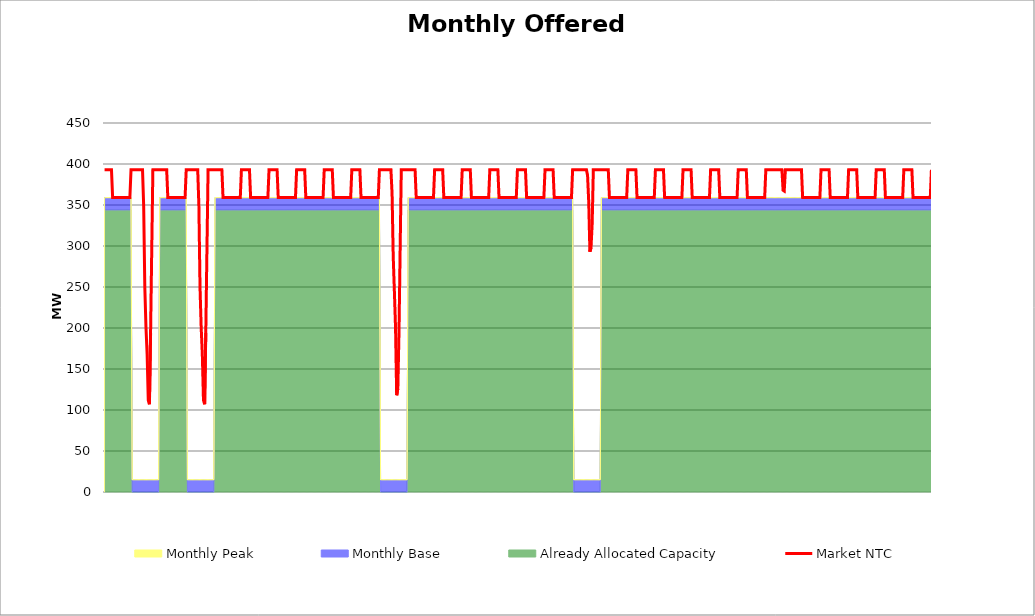
| Category | Market NTC |
|---|---|
| 0 | 393 |
| 1 | 393 |
| 2 | 393 |
| 3 | 393 |
| 4 | 393 |
| 5 | 393 |
| 6 | 393 |
| 7 | 359 |
| 8 | 359 |
| 9 | 359 |
| 10 | 359 |
| 11 | 359 |
| 12 | 359 |
| 13 | 359 |
| 14 | 359 |
| 15 | 359 |
| 16 | 359 |
| 17 | 359 |
| 18 | 359 |
| 19 | 359 |
| 20 | 359 |
| 21 | 359 |
| 22 | 359 |
| 23 | 393 |
| 24 | 393 |
| 25 | 393 |
| 26 | 393 |
| 27 | 393 |
| 28 | 393 |
| 29 | 393 |
| 30 | 393 |
| 31 | 393 |
| 32 | 393 |
| 33 | 393 |
| 34 | 349 |
| 35 | 249 |
| 36 | 201 |
| 37 | 168 |
| 38 | 112 |
| 39 | 107 |
| 40 | 194 |
| 41 | 294 |
| 42 | 393 |
| 43 | 393 |
| 44 | 393 |
| 45 | 393 |
| 46 | 393 |
| 47 | 393 |
| 48 | 393 |
| 49 | 393 |
| 50 | 393 |
| 51 | 393 |
| 52 | 393 |
| 53 | 393 |
| 54 | 393 |
| 55 | 359 |
| 56 | 359 |
| 57 | 359 |
| 58 | 359 |
| 59 | 359 |
| 60 | 359 |
| 61 | 359 |
| 62 | 359 |
| 63 | 359 |
| 64 | 359 |
| 65 | 359 |
| 66 | 359 |
| 67 | 359 |
| 68 | 359 |
| 69 | 359 |
| 70 | 359 |
| 71 | 393 |
| 72 | 393 |
| 73 | 393 |
| 74 | 393 |
| 75 | 393 |
| 76 | 393 |
| 77 | 393 |
| 78 | 393 |
| 79 | 393 |
| 80 | 393 |
| 81 | 393 |
| 82 | 349 |
| 83 | 249 |
| 84 | 201 |
| 85 | 168 |
| 86 | 112 |
| 87 | 107 |
| 88 | 194 |
| 89 | 294 |
| 90 | 393 |
| 91 | 393 |
| 92 | 393 |
| 93 | 393 |
| 94 | 393 |
| 95 | 393 |
| 96 | 393 |
| 97 | 393 |
| 98 | 393 |
| 99 | 393 |
| 100 | 393 |
| 101 | 393 |
| 102 | 393 |
| 103 | 359 |
| 104 | 359 |
| 105 | 359 |
| 106 | 359 |
| 107 | 359 |
| 108 | 359 |
| 109 | 359 |
| 110 | 359 |
| 111 | 359 |
| 112 | 359 |
| 113 | 359 |
| 114 | 359 |
| 115 | 359 |
| 116 | 359 |
| 117 | 359 |
| 118 | 359 |
| 119 | 393 |
| 120 | 393 |
| 121 | 393 |
| 122 | 393 |
| 123 | 393 |
| 124 | 393 |
| 125 | 393 |
| 126 | 393 |
| 127 | 359 |
| 128 | 359 |
| 129 | 359 |
| 130 | 359 |
| 131 | 359 |
| 132 | 359 |
| 133 | 359 |
| 134 | 359 |
| 135 | 359 |
| 136 | 359 |
| 137 | 359 |
| 138 | 359 |
| 139 | 359 |
| 140 | 359 |
| 141 | 359 |
| 142 | 359 |
| 143 | 393 |
| 144 | 393 |
| 145 | 393 |
| 146 | 393 |
| 147 | 393 |
| 148 | 393 |
| 149 | 393 |
| 150 | 393 |
| 151 | 359 |
| 152 | 359 |
| 153 | 359 |
| 154 | 359 |
| 155 | 359 |
| 156 | 359 |
| 157 | 359 |
| 158 | 359 |
| 159 | 359 |
| 160 | 359 |
| 161 | 359 |
| 162 | 359 |
| 163 | 359 |
| 164 | 359 |
| 165 | 359 |
| 166 | 359 |
| 167 | 393 |
| 168 | 393 |
| 169 | 393 |
| 170 | 393 |
| 171 | 393 |
| 172 | 393 |
| 173 | 393 |
| 174 | 393 |
| 175 | 359 |
| 176 | 359 |
| 177 | 359 |
| 178 | 359 |
| 179 | 359 |
| 180 | 359 |
| 181 | 359 |
| 182 | 359 |
| 183 | 359 |
| 184 | 359 |
| 185 | 359 |
| 186 | 359 |
| 187 | 359 |
| 188 | 359 |
| 189 | 359 |
| 190 | 359 |
| 191 | 393 |
| 192 | 393 |
| 193 | 393 |
| 194 | 393 |
| 195 | 393 |
| 196 | 393 |
| 197 | 393 |
| 198 | 393 |
| 199 | 359 |
| 200 | 359 |
| 201 | 359 |
| 202 | 359 |
| 203 | 359 |
| 204 | 359 |
| 205 | 359 |
| 206 | 359 |
| 207 | 359 |
| 208 | 359 |
| 209 | 359 |
| 210 | 359 |
| 211 | 359 |
| 212 | 359 |
| 213 | 359 |
| 214 | 359 |
| 215 | 393 |
| 216 | 393 |
| 217 | 393 |
| 218 | 393 |
| 219 | 393 |
| 220 | 393 |
| 221 | 393 |
| 222 | 393 |
| 223 | 359 |
| 224 | 359 |
| 225 | 359 |
| 226 | 359 |
| 227 | 359 |
| 228 | 359 |
| 229 | 359 |
| 230 | 359 |
| 231 | 359 |
| 232 | 359 |
| 233 | 359 |
| 234 | 359 |
| 235 | 359 |
| 236 | 359 |
| 237 | 359 |
| 238 | 359 |
| 239 | 393 |
| 240 | 393 |
| 241 | 393 |
| 242 | 393 |
| 243 | 393 |
| 244 | 393 |
| 245 | 393 |
| 246 | 393 |
| 247 | 393 |
| 248 | 393 |
| 249 | 393 |
| 250 | 364 |
| 251 | 287 |
| 252 | 245 |
| 253 | 201 |
| 254 | 118 |
| 255 | 126 |
| 256 | 194 |
| 257 | 294 |
| 258 | 393 |
| 259 | 393 |
| 260 | 393 |
| 261 | 393 |
| 262 | 393 |
| 263 | 393 |
| 264 | 393 |
| 265 | 393 |
| 266 | 393 |
| 267 | 393 |
| 268 | 393 |
| 269 | 393 |
| 270 | 393 |
| 271 | 359 |
| 272 | 359 |
| 273 | 359 |
| 274 | 359 |
| 275 | 359 |
| 276 | 359 |
| 277 | 359 |
| 278 | 359 |
| 279 | 359 |
| 280 | 359 |
| 281 | 359 |
| 282 | 359 |
| 283 | 359 |
| 284 | 359 |
| 285 | 359 |
| 286 | 359 |
| 287 | 393 |
| 288 | 393 |
| 289 | 393 |
| 290 | 393 |
| 291 | 393 |
| 292 | 393 |
| 293 | 393 |
| 294 | 393 |
| 295 | 359 |
| 296 | 359 |
| 297 | 359 |
| 298 | 359 |
| 299 | 359 |
| 300 | 359 |
| 301 | 359 |
| 302 | 359 |
| 303 | 359 |
| 304 | 359 |
| 305 | 359 |
| 306 | 359 |
| 307 | 359 |
| 308 | 359 |
| 309 | 359 |
| 310 | 359 |
| 311 | 393 |
| 312 | 393 |
| 313 | 393 |
| 314 | 393 |
| 315 | 393 |
| 316 | 393 |
| 317 | 393 |
| 318 | 393 |
| 319 | 359 |
| 320 | 359 |
| 321 | 359 |
| 322 | 359 |
| 323 | 359 |
| 324 | 359 |
| 325 | 359 |
| 326 | 359 |
| 327 | 359 |
| 328 | 359 |
| 329 | 359 |
| 330 | 359 |
| 331 | 359 |
| 332 | 359 |
| 333 | 359 |
| 334 | 359 |
| 335 | 393 |
| 336 | 393 |
| 337 | 393 |
| 338 | 393 |
| 339 | 393 |
| 340 | 393 |
| 341 | 393 |
| 342 | 393 |
| 343 | 359 |
| 344 | 359 |
| 345 | 359 |
| 346 | 359 |
| 347 | 359 |
| 348 | 359 |
| 349 | 359 |
| 350 | 359 |
| 351 | 359 |
| 352 | 359 |
| 353 | 359 |
| 354 | 359 |
| 355 | 359 |
| 356 | 359 |
| 357 | 359 |
| 358 | 359 |
| 359 | 393 |
| 360 | 393 |
| 361 | 393 |
| 362 | 393 |
| 363 | 393 |
| 364 | 393 |
| 365 | 393 |
| 366 | 393 |
| 367 | 359 |
| 368 | 359 |
| 369 | 359 |
| 370 | 359 |
| 371 | 359 |
| 372 | 359 |
| 373 | 359 |
| 374 | 359 |
| 375 | 359 |
| 376 | 359 |
| 377 | 359 |
| 378 | 359 |
| 379 | 359 |
| 380 | 359 |
| 381 | 359 |
| 382 | 359 |
| 383 | 393 |
| 384 | 393 |
| 385 | 393 |
| 386 | 393 |
| 387 | 393 |
| 388 | 393 |
| 389 | 393 |
| 390 | 393 |
| 391 | 359 |
| 392 | 359 |
| 393 | 359 |
| 394 | 359 |
| 395 | 359 |
| 396 | 359 |
| 397 | 359 |
| 398 | 359 |
| 399 | 359 |
| 400 | 359 |
| 401 | 359 |
| 402 | 359 |
| 403 | 359 |
| 404 | 359 |
| 405 | 359 |
| 406 | 359 |
| 407 | 393 |
| 408 | 393 |
| 409 | 393 |
| 410 | 393 |
| 411 | 393 |
| 412 | 393 |
| 413 | 393 |
| 414 | 393 |
| 415 | 393 |
| 416 | 393 |
| 417 | 393 |
| 418 | 393 |
| 419 | 393 |
| 420 | 386 |
| 421 | 354 |
| 422 | 293 |
| 423 | 298 |
| 424 | 327 |
| 425 | 393 |
| 426 | 393 |
| 427 | 393 |
| 428 | 393 |
| 429 | 393 |
| 430 | 393 |
| 431 | 393 |
| 432 | 393 |
| 433 | 393 |
| 434 | 393 |
| 435 | 393 |
| 436 | 393 |
| 437 | 393 |
| 438 | 393 |
| 439 | 359 |
| 440 | 359 |
| 441 | 359 |
| 442 | 359 |
| 443 | 359 |
| 444 | 359 |
| 445 | 359 |
| 446 | 359 |
| 447 | 359 |
| 448 | 359 |
| 449 | 359 |
| 450 | 359 |
| 451 | 359 |
| 452 | 359 |
| 453 | 359 |
| 454 | 359 |
| 455 | 393 |
| 456 | 393 |
| 457 | 393 |
| 458 | 393 |
| 459 | 393 |
| 460 | 393 |
| 461 | 393 |
| 462 | 393 |
| 463 | 359 |
| 464 | 359 |
| 465 | 359 |
| 466 | 359 |
| 467 | 359 |
| 468 | 359 |
| 469 | 359 |
| 470 | 359 |
| 471 | 359 |
| 472 | 359 |
| 473 | 359 |
| 474 | 359 |
| 475 | 359 |
| 476 | 359 |
| 477 | 359 |
| 478 | 359 |
| 479 | 393 |
| 480 | 393 |
| 481 | 393 |
| 482 | 393 |
| 483 | 393 |
| 484 | 393 |
| 485 | 393 |
| 486 | 393 |
| 487 | 359 |
| 488 | 359 |
| 489 | 359 |
| 490 | 359 |
| 491 | 359 |
| 492 | 359 |
| 493 | 359 |
| 494 | 359 |
| 495 | 359 |
| 496 | 359 |
| 497 | 359 |
| 498 | 359 |
| 499 | 359 |
| 500 | 359 |
| 501 | 359 |
| 502 | 359 |
| 503 | 393 |
| 504 | 393 |
| 505 | 393 |
| 506 | 393 |
| 507 | 393 |
| 508 | 393 |
| 509 | 393 |
| 510 | 393 |
| 511 | 359 |
| 512 | 359 |
| 513 | 359 |
| 514 | 359 |
| 515 | 359 |
| 516 | 359 |
| 517 | 359 |
| 518 | 359 |
| 519 | 359 |
| 520 | 359 |
| 521 | 359 |
| 522 | 359 |
| 523 | 359 |
| 524 | 359 |
| 525 | 359 |
| 526 | 359 |
| 527 | 393 |
| 528 | 393 |
| 529 | 393 |
| 530 | 393 |
| 531 | 393 |
| 532 | 393 |
| 533 | 393 |
| 534 | 393 |
| 535 | 359 |
| 536 | 359 |
| 537 | 359 |
| 538 | 359 |
| 539 | 359 |
| 540 | 359 |
| 541 | 359 |
| 542 | 359 |
| 543 | 359 |
| 544 | 359 |
| 545 | 359 |
| 546 | 359 |
| 547 | 359 |
| 548 | 359 |
| 549 | 359 |
| 550 | 359 |
| 551 | 393 |
| 552 | 393 |
| 553 | 393 |
| 554 | 393 |
| 555 | 393 |
| 556 | 393 |
| 557 | 393 |
| 558 | 393 |
| 559 | 359 |
| 560 | 359 |
| 561 | 359 |
| 562 | 359 |
| 563 | 359 |
| 564 | 359 |
| 565 | 359 |
| 566 | 359 |
| 567 | 359 |
| 568 | 359 |
| 569 | 359 |
| 570 | 359 |
| 571 | 359 |
| 572 | 359 |
| 573 | 359 |
| 574 | 359 |
| 575 | 393 |
| 576 | 393 |
| 577 | 393 |
| 578 | 393 |
| 579 | 393 |
| 580 | 393 |
| 581 | 393 |
| 582 | 393 |
| 583 | 393 |
| 584 | 393 |
| 585 | 393 |
| 586 | 393 |
| 587 | 393 |
| 588 | 393 |
| 589 | 393 |
| 590 | 368 |
| 591 | 367 |
| 592 | 393 |
| 593 | 393 |
| 594 | 393 |
| 595 | 393 |
| 596 | 393 |
| 597 | 393 |
| 598 | 393 |
| 599 | 393 |
| 600 | 393 |
| 601 | 393 |
| 602 | 393 |
| 603 | 393 |
| 604 | 393 |
| 605 | 393 |
| 606 | 393 |
| 607 | 359 |
| 608 | 359 |
| 609 | 359 |
| 610 | 359 |
| 611 | 359 |
| 612 | 359 |
| 613 | 359 |
| 614 | 359 |
| 615 | 359 |
| 616 | 359 |
| 617 | 359 |
| 618 | 359 |
| 619 | 359 |
| 620 | 359 |
| 621 | 359 |
| 622 | 359 |
| 623 | 393 |
| 624 | 393 |
| 625 | 393 |
| 626 | 393 |
| 627 | 393 |
| 628 | 393 |
| 629 | 393 |
| 630 | 393 |
| 631 | 359 |
| 632 | 359 |
| 633 | 359 |
| 634 | 359 |
| 635 | 359 |
| 636 | 359 |
| 637 | 359 |
| 638 | 359 |
| 639 | 359 |
| 640 | 359 |
| 641 | 359 |
| 642 | 359 |
| 643 | 359 |
| 644 | 359 |
| 645 | 359 |
| 646 | 359 |
| 647 | 393 |
| 648 | 393 |
| 649 | 393 |
| 650 | 393 |
| 651 | 393 |
| 652 | 393 |
| 653 | 393 |
| 654 | 393 |
| 655 | 359 |
| 656 | 359 |
| 657 | 359 |
| 658 | 359 |
| 659 | 359 |
| 660 | 359 |
| 661 | 359 |
| 662 | 359 |
| 663 | 359 |
| 664 | 359 |
| 665 | 359 |
| 666 | 359 |
| 667 | 359 |
| 668 | 359 |
| 669 | 359 |
| 670 | 359 |
| 671 | 393 |
| 672 | 393 |
| 673 | 393 |
| 674 | 393 |
| 675 | 393 |
| 676 | 393 |
| 677 | 393 |
| 678 | 393 |
| 679 | 359 |
| 680 | 359 |
| 681 | 359 |
| 682 | 359 |
| 683 | 359 |
| 684 | 359 |
| 685 | 359 |
| 686 | 359 |
| 687 | 359 |
| 688 | 359 |
| 689 | 359 |
| 690 | 359 |
| 691 | 359 |
| 692 | 359 |
| 693 | 359 |
| 694 | 359 |
| 695 | 393 |
| 696 | 393 |
| 697 | 393 |
| 698 | 393 |
| 699 | 393 |
| 700 | 393 |
| 701 | 393 |
| 702 | 393 |
| 703 | 359 |
| 704 | 359 |
| 705 | 359 |
| 706 | 359 |
| 707 | 359 |
| 708 | 359 |
| 709 | 359 |
| 710 | 359 |
| 711 | 359 |
| 712 | 359 |
| 713 | 359 |
| 714 | 359 |
| 715 | 359 |
| 716 | 359 |
| 717 | 359 |
| 718 | 359 |
| 719 | 393 |